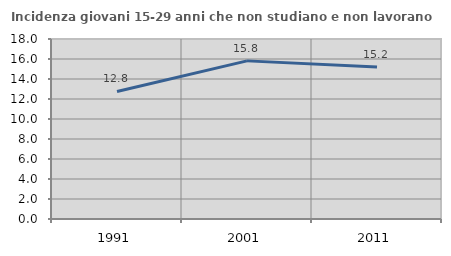
| Category | Incidenza giovani 15-29 anni che non studiano e non lavorano  |
|---|---|
| 1991.0 | 12.752 |
| 2001.0 | 15.812 |
| 2011.0 | 15.194 |